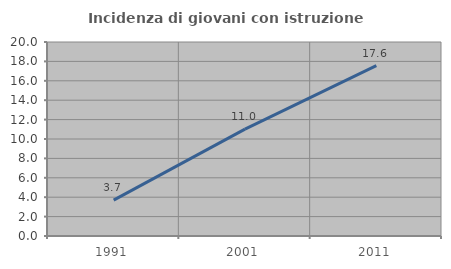
| Category | Incidenza di giovani con istruzione universitaria |
|---|---|
| 1991.0 | 3.704 |
| 2001.0 | 11.011 |
| 2011.0 | 17.555 |